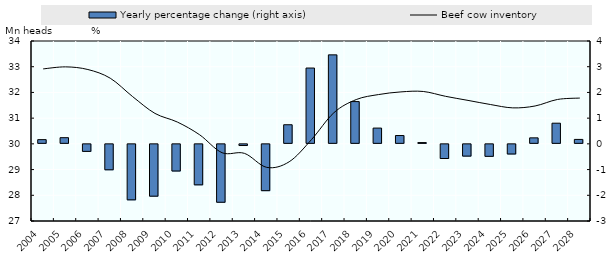
| Category | Yearly percentage change (right axis) |
|---|---|
| 2004.0 | 0.164 |
| 2005.0 | 0.24 |
| 2006.0 | -0.312 |
| 2007.0 | -1.028 |
| 2008.0 | -2.196 |
| 2009.0 | -2.054 |
| 2010.0 | -1.075 |
| 2011.0 | -1.613 |
| 2012.0 | -2.291 |
| 2013.0 | -0.084 |
| 2014.0 | -1.84 |
| 2015.0 | 0.743 |
| 2016.0 | 2.949 |
| 2017.0 | 3.461 |
| 2018.0 | 1.644 |
| 2019.0 | 0.613 |
| 2020.0 | 0.324 |
| 2021.0 | 0.05 |
| 2022.0 | -0.589 |
| 2023.0 | -0.496 |
| 2024.0 | -0.505 |
| 2025.0 | -0.414 |
| 2026.0 | 0.233 |
| 2027.0 | 0.804 |
| 2028.0 | 0.173 |